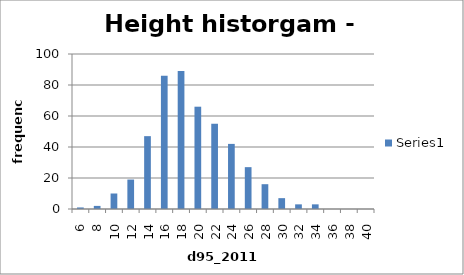
| Category | Series 0 |
|---|---|
| 6.0 | 1 |
| 8.0 | 2 |
| 10.0 | 10 |
| 12.0 | 19 |
| 14.0 | 47 |
| 16.0 | 86 |
| 18.0 | 89 |
| 20.0 | 66 |
| 22.0 | 55 |
| 24.0 | 42 |
| 26.0 | 27 |
| 28.0 | 16 |
| 30.0 | 7 |
| 32.0 | 3 |
| 34.0 | 3 |
| 36.0 | 0 |
| 38.0 | 0 |
| 40.0 | 0 |